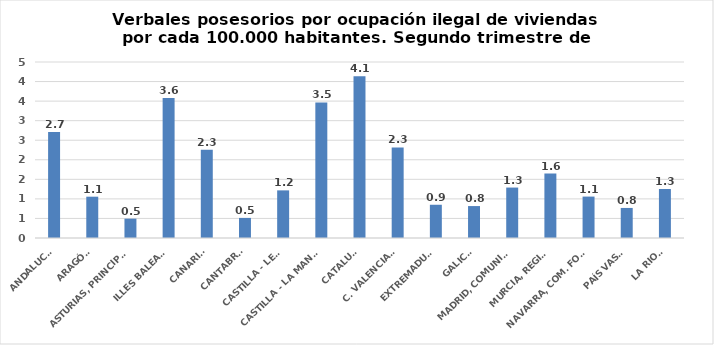
| Category | Series 0 |
|---|---|
| ANDALUCÍA | 2.71 |
| ARAGÓN | 1.056 |
| ASTURIAS, PRINCIPADO | 0.494 |
| ILLES BALEARS | 3.583 |
| CANARIAS | 2.257 |
| CANTABRIA | 0.513 |
| CASTILLA - LEÓN | 1.218 |
| CASTILLA - LA MANCHA | 3.467 |
| CATALUÑA | 4.138 |
| C. VALENCIANA | 2.317 |
| EXTREMADURA | 0.85 |
| GALICIA | 0.817 |
| MADRID, COMUNIDAD | 1.29 |
| MURCIA, REGIÓN | 1.647 |
| NAVARRA, COM. FORAL | 1.059 |
| PAÍS VASCO | 0.768 |
| LA RIOJA | 1.253 |